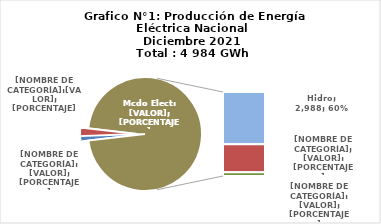
| Category | Series 0 |
|---|---|
| 0 | 62.384 |
| 1 | 121.098 |
| 2 | 2988.309 |
| 3 | 1593.781 |
| 4 | 217.994 |